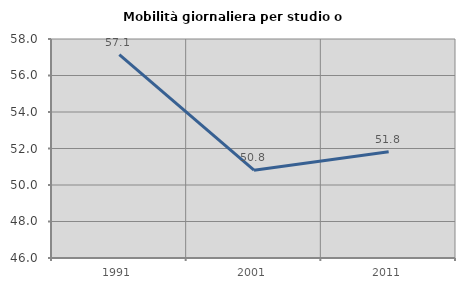
| Category | Mobilità giornaliera per studio o lavoro |
|---|---|
| 1991.0 | 57.149 |
| 2001.0 | 50.809 |
| 2011.0 | 51.819 |